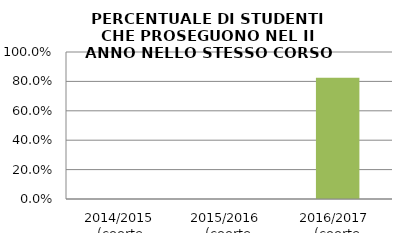
| Category | 2014/2015 (coorte 2013/14) 2015/2016  (coorte 2014/15) 2016/2017  (coorte 2015/16) |
|---|---|
| 2014/2015 (coorte 2013/14) | 0 |
| 2015/2016  (coorte 2014/15) | 0 |
| 2016/2017  (coorte 2015/16) | 0.825 |